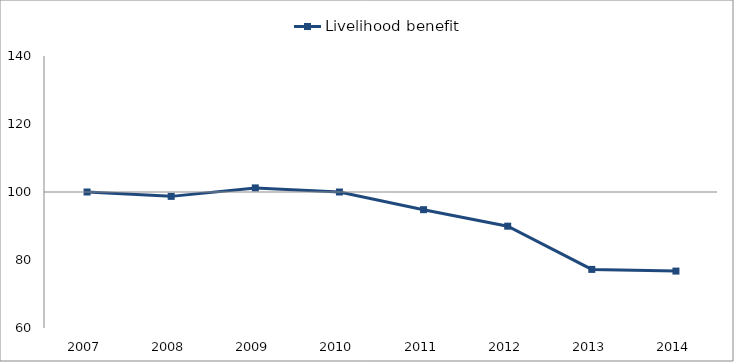
| Category | Livelihood benefit |
|---|---|
| 2007.0 | 100 |
| 2008.0 | 98.715 |
| 2009.0 | 101.206 |
| 2010.0 | 99.998 |
| 2011.0 | 94.801 |
| 2012.0 | 89.947 |
| 2013.0 | 77.235 |
| 2014.0 | 76.738 |